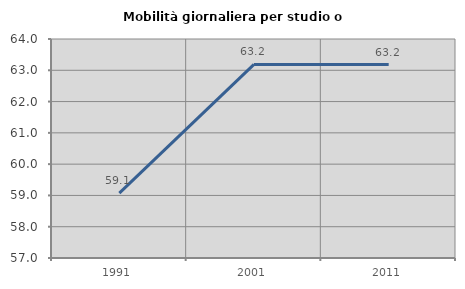
| Category | Mobilità giornaliera per studio o lavoro |
|---|---|
| 1991.0 | 59.076 |
| 2001.0 | 63.188 |
| 2011.0 | 63.184 |